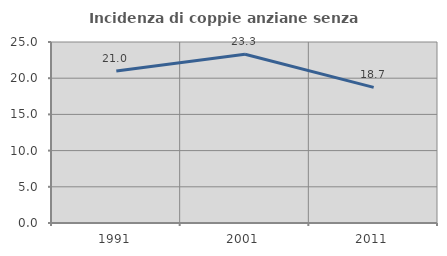
| Category | Incidenza di coppie anziane senza figli  |
|---|---|
| 1991.0 | 21.002 |
| 2001.0 | 23.306 |
| 2011.0 | 18.729 |